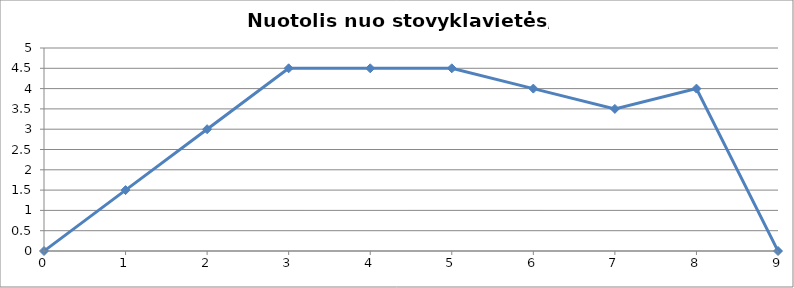
| Category | Atstumas s, km |
|---|---|
| 0.0 | 0 |
| 1.0 | 1.5 |
| 2.0 | 3 |
| 3.0 | 4.5 |
| 4.0 | 4.5 |
| 5.0 | 4.5 |
| 6.0 | 4 |
| 7.0 | 3.5 |
| 8.0 | 4 |
| 9.0 | 0 |